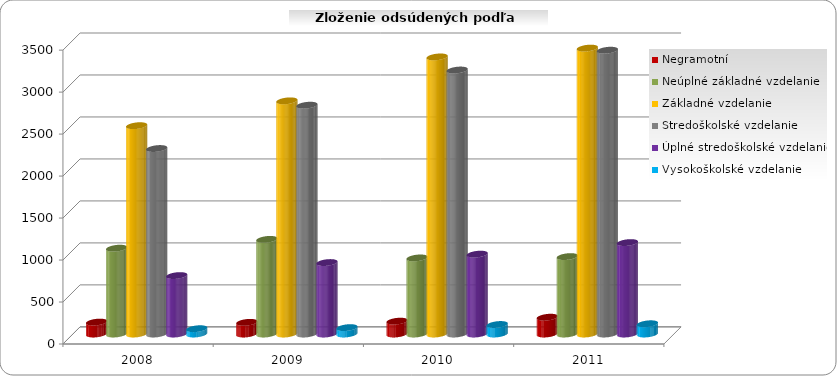
| Category | Negramotní | Neúplné základné vzdelanie | Základné vzdelanie | Stredoškolské vzdelanie | Úplné stredoškolské vzdelanie | Vysokoškolské vzdelanie |
|---|---|---|---|---|---|---|
| 2008.0 | 142 | 1022 | 2481 | 2209 | 696 | 63 |
| 2009.0 | 139 | 1127 | 2777 | 2725 | 851 | 76 |
| 2010.0 | 153 | 906 | 3300 | 3144 | 951 | 113 |
| 2011.0 | 200 | 922 | 3405 | 3380 | 1089 | 122 |